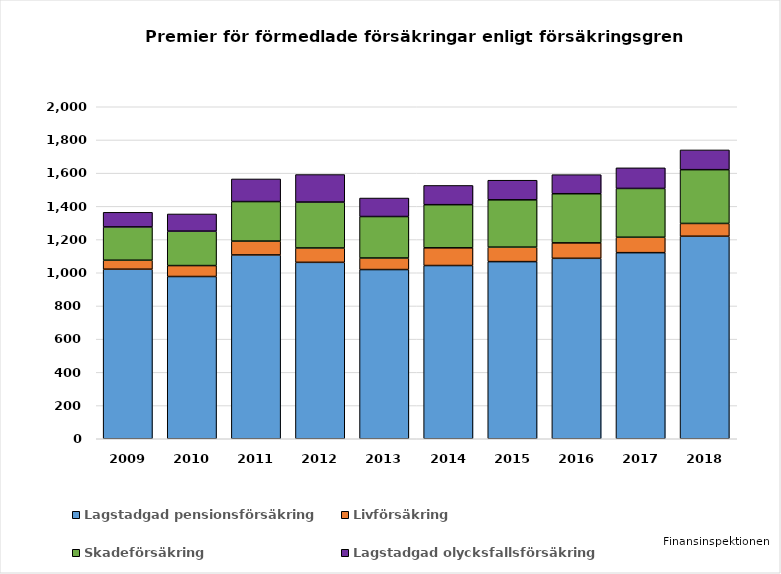
| Category | Lagstadgad pensionsförsäkring | Livförsäkring | Skadeförsäkring | Lagstadgad olycksfallsförsäkring |
|---|---|---|---|---|
| 2009.0 | 1021.457 | 54.107 | 200.56 | 88.041 |
| 2010.0 | 977.321 | 65.95 | 207.341 | 103.558 |
| 2011.0 | 1107.329 | 83.403 | 238.041 | 136.289 |
| 2012.0 | 1062.705 | 86.597 | 276.62 | 165.706 |
| 2013.0 | 1019.216 | 69.648 | 249.823 | 111.515 |
| 2014.0 | 1043.573 | 106.619 | 259.835 | 115.957 |
| 2015.0 | 1067.062 | 87.285 | 284.943 | 118.153 |
| 2016.0 | 1087 | 93 | 296 | 115 |
| 2017.0 | 1121 | 93 | 294 | 124 |
| 2018.0 | 1220 | 77 | 324 | 119 |